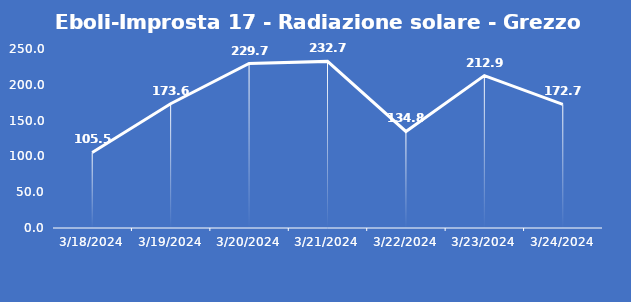
| Category | Eboli-Improsta 17 - Radiazione solare - Grezzo (W/m2) |
|---|---|
| 3/18/24 | 105.5 |
| 3/19/24 | 173.6 |
| 3/20/24 | 229.7 |
| 3/21/24 | 232.7 |
| 3/22/24 | 134.8 |
| 3/23/24 | 212.9 |
| 3/24/24 | 172.7 |